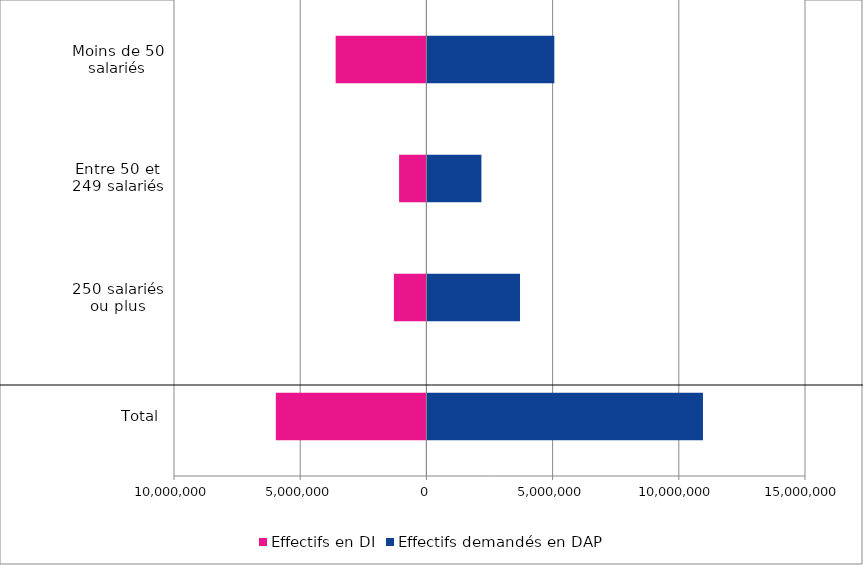
| Category | Effectifs en DI | Effectifs demandés en DAP |
|---|---|---|
| Total | -5965965 | 10956960 |
| 250 salariés ou plus | -1288368 | 3709171 |
| Entre 50 et 249 salariés | -1082009 | 2179510 |
| Moins de 50 salariés | -3595588 | 5068279 |